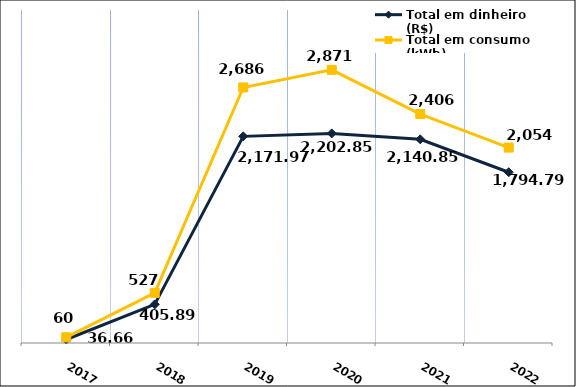
| Category | Total em dinheiro (R$) |
|---|---|
| 2017.0 | 36.66 |
| 2018.0 | 405.89 |
| 2019.0 | 2171.97 |
| 2020.0 | 2202.85 |
| 2021.0 | 2140.85 |
| 2022.0 | 1794.79 |